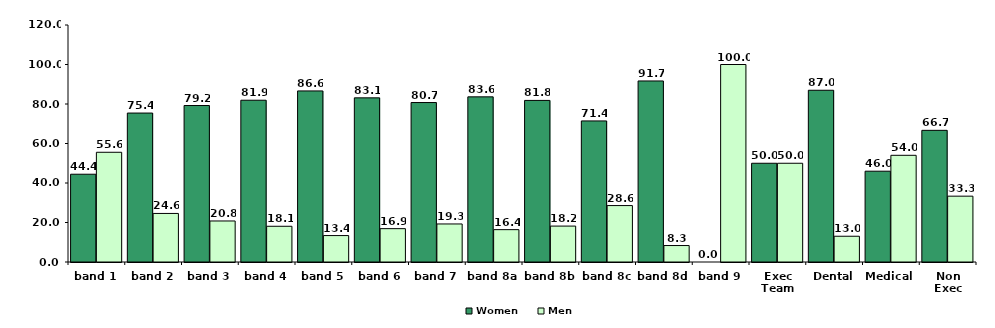
| Category | Women | Men |
|---|---|---|
| band 1 | 44.444 | 55.556 |
| band 2 | 75.414 | 24.586 |
| band 3 | 79.226 | 20.774 |
| band 4 | 81.91 | 18.09 |
| band 5 | 86.617 | 13.383 |
| band 6 | 83.112 | 16.888 |
| band 7 | 80.741 | 19.259 |
| band 8a | 83.616 | 16.384 |
| band 8b | 81.818 | 18.182 |
| band 8c | 71.429 | 28.571 |
| band 8d | 91.667 | 8.333 |
| band 9 | 0 | 100 |
| Exec Team | 50 | 50 |
| Dental | 86.957 | 13.043 |
| Medical | 45.977 | 54.023 |
| Non Exec | 66.667 | 33.333 |